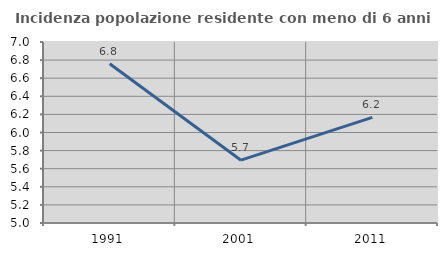
| Category | Incidenza popolazione residente con meno di 6 anni |
|---|---|
| 1991.0 | 6.76 |
| 2001.0 | 5.694 |
| 2011.0 | 6.166 |